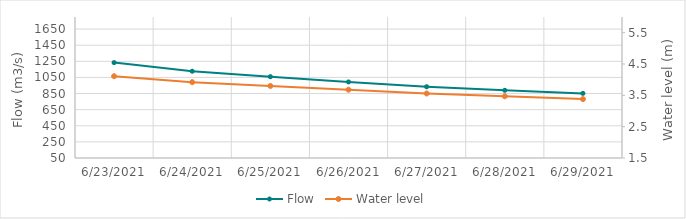
| Category | Flow |
|---|---|
| 6/6/21 | 1674.93 |
| 6/5/21 | 1687.97 |
| 6/4/21 | 1713.04 |
| 6/3/21 | 1706.09 |
| 6/2/21 | 1680.92 |
| 6/1/21 | 1617.33 |
| 5/31/21 | 1491.54 |